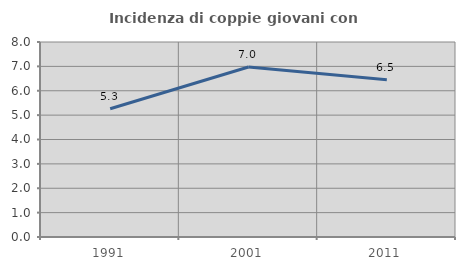
| Category | Incidenza di coppie giovani con figli |
|---|---|
| 1991.0 | 5.263 |
| 2001.0 | 6.977 |
| 2011.0 | 6.452 |